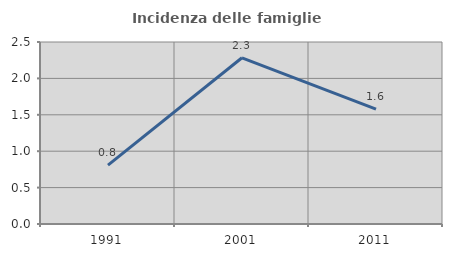
| Category | Incidenza delle famiglie numerose |
|---|---|
| 1991.0 | 0.81 |
| 2001.0 | 2.283 |
| 2011.0 | 1.579 |